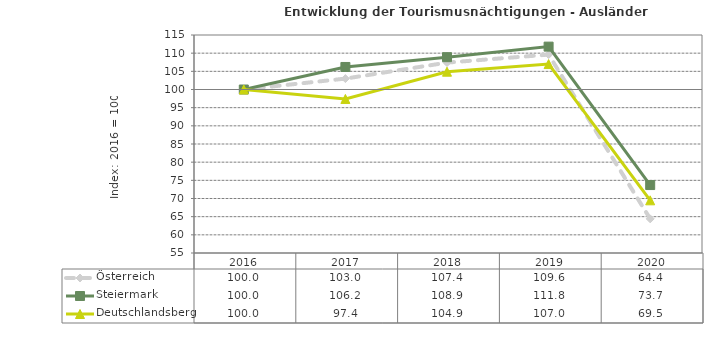
| Category | Österreich | Steiermark | Deutschlandsberg |
|---|---|---|---|
| 2020.0 | 64.4 | 73.7 | 69.5 |
| 2019.0 | 109.6 | 111.8 | 107 |
| 2018.0 | 107.4 | 108.9 | 104.9 |
| 2017.0 | 103 | 106.2 | 97.4 |
| 2016.0 | 100 | 100 | 100 |